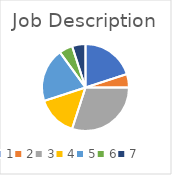
| Category | Series 0 |
|---|---|
| 0 | 0.2 |
| 1 | 0.05 |
| 2 | 0.3 |
| 3 | 0.15 |
| 4 | 0.2 |
| 5 | 0.05 |
| 6 | 0.05 |